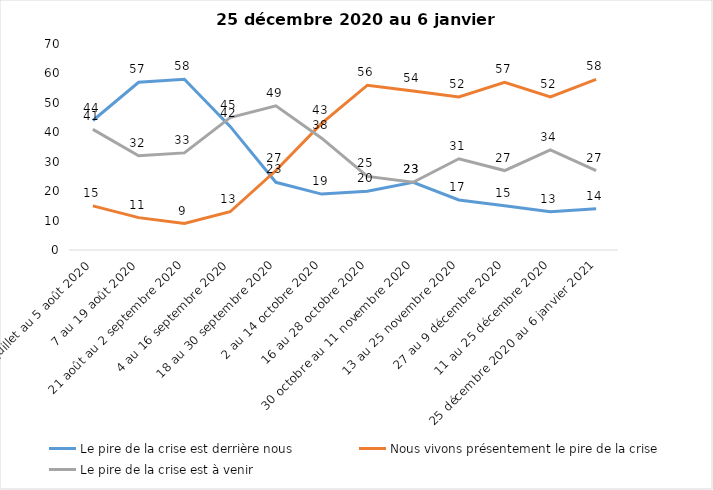
| Category | Le pire de la crise est derrière nous | Nous vivons présentement le pire de la crise | Le pire de la crise est à venir |
|---|---|---|---|
| 24 juillet au 5 août 2020 | 44 | 15 | 41 |
| 7 au 19 août 2020 | 57 | 11 | 32 |
| 21 août au 2 septembre 2020 | 58 | 9 | 33 |
| 4 au 16 septembre 2020 | 42 | 13 | 45 |
| 18 au 30 septembre 2020 | 23 | 27 | 49 |
| 2 au 14 octobre 2020 | 19 | 43 | 38 |
| 16 au 28 octobre 2020 | 20 | 56 | 25 |
| 30 octobre au 11 novembre 2020 | 23 | 54 | 23 |
| 13 au 25 novembre 2020 | 17 | 52 | 31 |
| 27 au 9 décembre 2020 | 15 | 57 | 27 |
| 11 au 25 décembre 2020 | 13 | 52 | 34 |
| 25 décembre 2020 au 6 janvier 2021 | 14 | 58 | 27 |